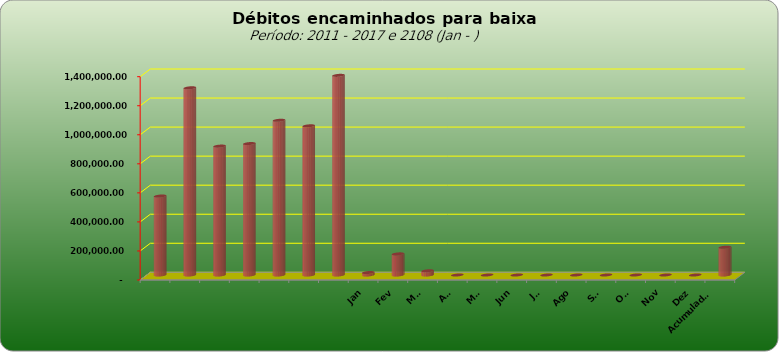
| Category |  543.796,20  |
|---|---|
|  | 543796.2 |
|  | 1289053.69 |
|  | 887573.08 |
|  | 905052.31 |
|  | 1065434.28 |
|  | 1027209.41 |
|  | 1374800.36 |
| Jan | 17005.62 |
| Fev | 145413 |
| Mar | 28943.58 |
| Abr | 0 |
| Mai | 0 |
| Jun | 0 |
| Jul | 0 |
| Ago | 0 |
| Set | 0 |
| Out | 0 |
| Nov | 0 |
| Dez | 0 |
| Acumulado
2016 | 191362.2 |